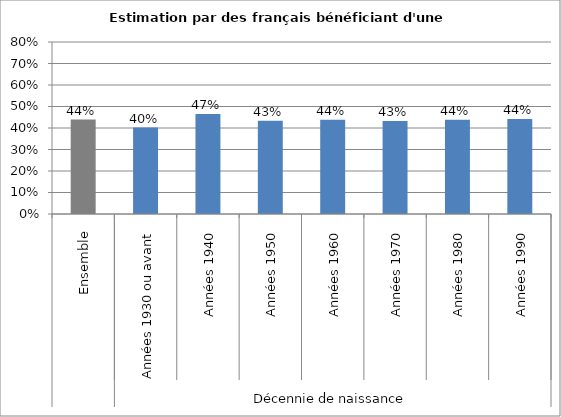
| Category | Estimation par des français bénéficiant d'une transmission |
|---|---|
| 0 | 0.439 |
| 1 | 0.402 |
| 2 | 0.465 |
| 3 | 0.434 |
| 4 | 0.438 |
| 5 | 0.433 |
| 6 | 0.438 |
| 7 | 0.442 |